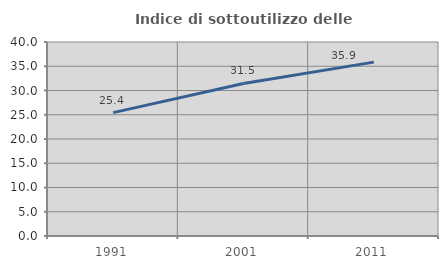
| Category | Indice di sottoutilizzo delle abitazioni  |
|---|---|
| 1991.0 | 25.431 |
| 2001.0 | 31.453 |
| 2011.0 | 35.851 |